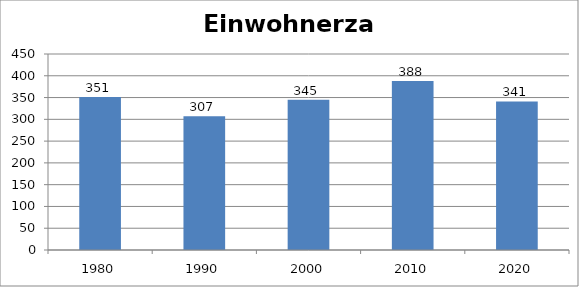
| Category | Einwohnerzahl |
|---|---|
| 1980.0 | 351 |
| 1990.0 | 307 |
| 2000.0 | 345 |
| 2010.0 | 388 |
| 2020.0 | 341 |